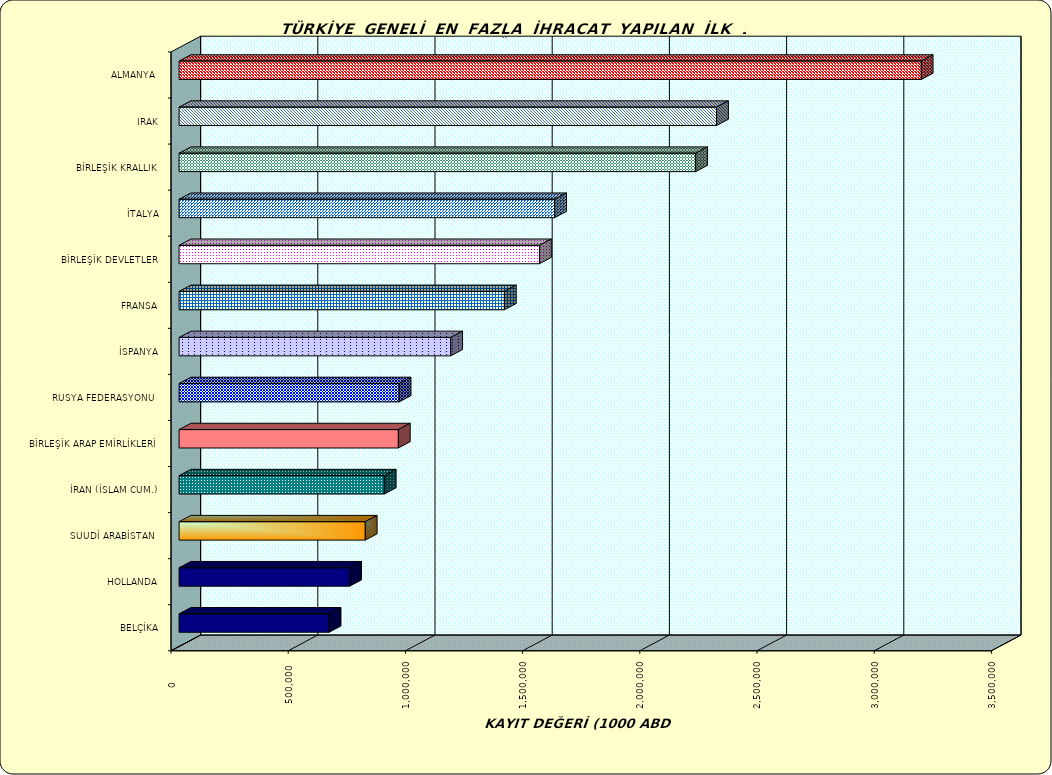
| Category | Series 0 |
|---|---|
| ALMANYA  | 3166269.7 |
| IRAK | 2293099.052 |
| BİRLEŞİK KRALLIK | 2204017.409 |
| İTALYA | 1602480.405 |
| BİRLEŞİK DEVLETLER | 1537559.015 |
| FRANSA | 1387909.305 |
| İSPANYA | 1158823 |
| RUSYA FEDERASYONU  | 938775.63 |
| BİRLEŞİK ARAP EMİRLİKLERİ | 935465.24 |
| İRAN (İSLAM CUM.) | 875393.362 |
| SUUDİ ARABİSTAN  | 794341.716 |
| HOLLANDA | 727810.551 |
| BELÇİKA | 640095.092 |